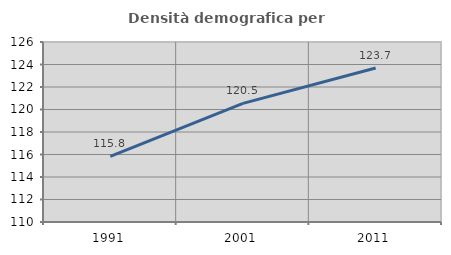
| Category | Densità demografica |
|---|---|
| 1991.0 | 115.826 |
| 2001.0 | 120.543 |
| 2011.0 | 123.688 |